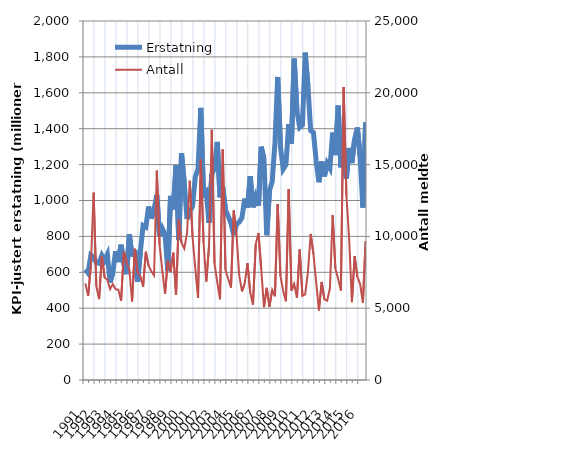
| Category | Erstatning |
|---|---|
| 1991.0 | 616.265 |
| nan | 596.168 |
| nan | 695.61 |
| nan | 683.787 |
| 1992.0 | 654.264 |
| nan | 650.086 |
| nan | 694.114 |
| nan | 666.281 |
| 1993.0 | 699.623 |
| nan | 543.342 |
| nan | 599.474 |
| nan | 717.435 |
| 1994.0 | 656.906 |
| nan | 753.578 |
| nan | 645.873 |
| nan | 589.696 |
| 1995.0 | 812.756 |
| nan | 686.966 |
| nan | 724.85 |
| nan | 546.639 |
| 1996.0 | 712.208 |
| nan | 860.409 |
| nan | 851.828 |
| nan | 966.551 |
| 1997.0 | 899.002 |
| nan | 950.697 |
| nan | 1030.685 |
| nan | 801.293 |
| 1998.0 | 844.15 |
| nan | 808.933 |
| nan | 606.267 |
| nan | 1025.385 |
| 1999.0 | 950.061 |
| nan | 1196.371 |
| nan | 779.416 |
| nan | 1263.603 |
| 2000.0 | 1095.813 |
| nan | 896.795 |
| nan | 937.576 |
| nan | 967.604 |
| 2001.0 | 1131.039 |
| nan | 1177.33 |
| nan | 1515.944 |
| nan | 1033.131 |
| 2002.0 | 1049.331 |
| nan | 875.783 |
| nan | 1142.763 |
| nan | 1182.003 |
| 2003.0 | 1326.27 |
| nan | 1018.063 |
| nan | 1074.673 |
| nan | 946.444 |
| 2004.0 | 912.797 |
| nan | 873.195 |
| nan | 807.5 |
| nan | 869.948 |
| 2005.0 | 879.375 |
| nan | 904.695 |
| nan | 1010.665 |
| nan | 959.076 |
| 2006.0 | 1135.665 |
| nan | 961.881 |
| nan | 1020.075 |
| nan | 970.376 |
| 2007.0 | 1299.486 |
| nan | 1231.02 |
| nan | 806.52 |
| nan | 1055.097 |
| 2008.0 | 1105.097 |
| nan | 1322.141 |
| nan | 1688.162 |
| nan | 1300.465 |
| 2009.0 | 1174.208 |
| nan | 1198.81 |
| nan | 1424.867 |
| nan | 1316.505 |
| 2010.0 | 1790.678 |
| nan | 1498.539 |
| nan | 1406.97 |
| nan | 1420.541 |
| 2011.0 | 1823.95 |
| nan | 1636.407 |
| nan | 1388.709 |
| nan | 1378.57 |
| 2012.0 | 1221.062 |
| nan | 1101.625 |
| nan | 1217.401 |
| nan | 1134.299 |
| 2013.0 | 1206.888 |
| nan | 1180.135 |
| nan | 1378.612 |
| nan | 1252.996 |
| 2014.0 | 1528.653 |
| nan | 1185.046 |
| nan | 1285.623 |
| nan | 1122.101 |
| 2015.0 | 1292.782 |
| nan | 1208.47 |
| nan | 1342.065 |
| nan | 1406.226 |
| 2016.0 | 1241.425 |
| nan | 960.598 |
| nan | 1435.96 |